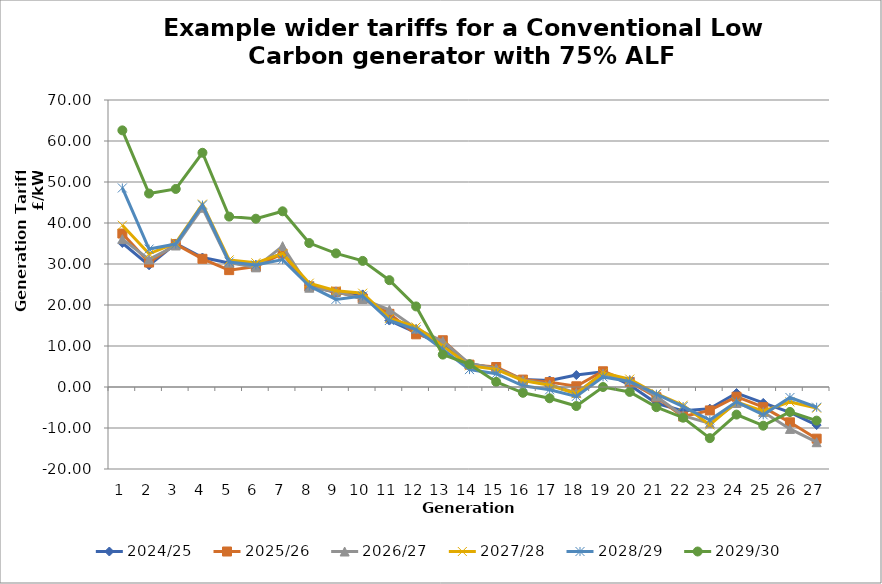
| Category | 2024/25 | 2025/26 | 2026/27 | 2027/28 | 2028/29 | 2029/30 |
|---|---|---|---|---|---|---|
| 0 | 35.126 | 37.431 | 36.07 | 39.446 | 48.546 | 62.594 |
| 1 | 29.688 | 30.351 | 31.114 | 32.486 | 33.637 | 47.189 |
| 2 | 35.007 | 34.851 | 34.512 | 35.138 | 34.855 | 48.308 |
| 3 | 31.58 | 31.266 | 43.721 | 44.603 | 44.378 | 57.128 |
| 4 | 30.235 | 28.506 | 30.327 | 31.002 | 30.479 | 41.557 |
| 5 | 29.801 | 29.377 | 29.185 | 30.292 | 29.738 | 41.046 |
| 6 | 32.649 | 32.525 | 34.353 | 32.545 | 31.063 | 42.857 |
| 7 | 24.862 | 24.541 | 24.226 | 25.317 | 24.645 | 35.11 |
| 8 | 22.957 | 23.232 | 23.345 | 23.475 | 21.371 | 32.595 |
| 9 | 22.584 | 21.597 | 21.452 | 22.881 | 22.195 | 30.756 |
| 10 | 16.205 | 17.846 | 18.828 | 16.723 | 16.222 | 26.056 |
| 11 | 13.232 | 12.849 | 14.256 | 14.64 | 14.013 | 19.651 |
| 12 | 10.203 | 11.403 | 11.17 | 10.038 | 9.128 | 7.899 |
| 13 | 5.669 | 5.456 | 5.723 | 5.179 | 4.248 | 5.555 |
| 14 | 4.538 | 4.875 | 4.521 | 4.299 | 3.25 | 1.243 |
| 15 | 1.818 | 1.808 | 1.71 | 1.595 | 0.285 | -1.414 |
| 16 | 1.583 | 1.188 | 0.59 | 0.421 | -0.675 | -2.752 |
| 17 | 2.918 | 0.178 | -1.447 | -1.636 | -2.296 | -4.643 |
| 18 | 3.693 | 3.836 | 3.245 | 3.446 | 2.457 | -0.002 |
| 19 | 0.486 | 1.229 | 1.736 | 1.932 | 1.359 | -1.198 |
| 20 | -3.979 | -2.502 | -2.318 | -1.635 | -1.761 | -4.916 |
| 21 | -5.821 | -7.2 | -7.011 | -4.447 | -4.78 | -7.492 |
| 22 | -5.274 | -5.712 | -8.875 | -9.239 | -8.06 | -12.476 |
| 23 | -1.471 | -2.367 | -3.895 | -3.651 | -3.615 | -6.733 |
| 24 | -3.885 | -4.919 | -6.122 | -5.894 | -6.795 | -9.439 |
| 25 | -6.185 | -8.615 | -10.221 | -3.639 | -2.558 | -6.087 |
| 26 | -9.293 | -12.603 | -13.467 | -5.161 | -4.935 | -8.201 |